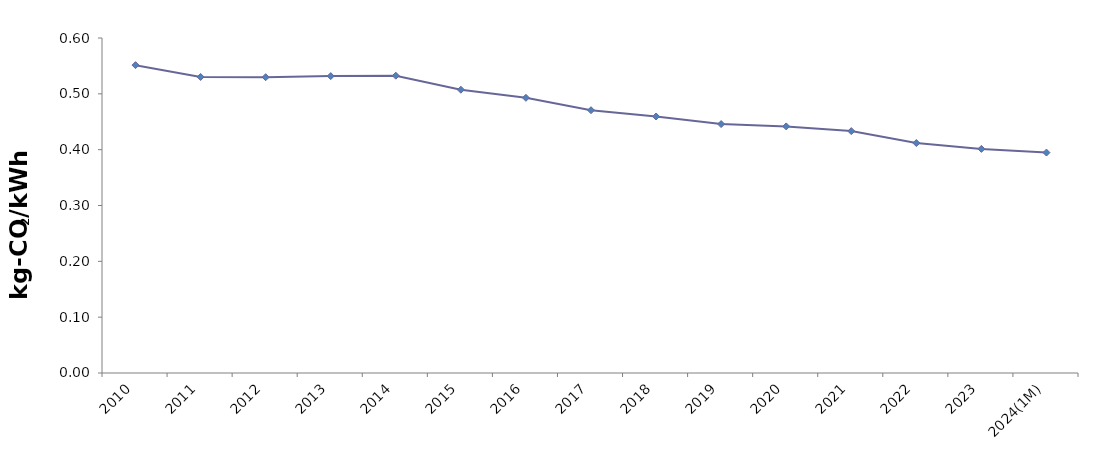
| Category | CO2/kWh
 (kg-CO2 / kWh) |
|---|---|
| 2010 | 0.551 |
| 2011 | 0.53 |
| 2012 | 0.53 |
| 2013 | 0.532 |
| 2014 | 0.532 |
| 2015 | 0.507 |
| 2016 | 0.493 |
| 2017 | 0.471 |
| 2018 | 0.459 |
| 2019 | 0.446 |
| 2020 | 0.442 |
| 2021 | 0.433 |
| 2022 | 0.412 |
| 2023 | 0.401 |
| 2024(1M) | 0.395 |